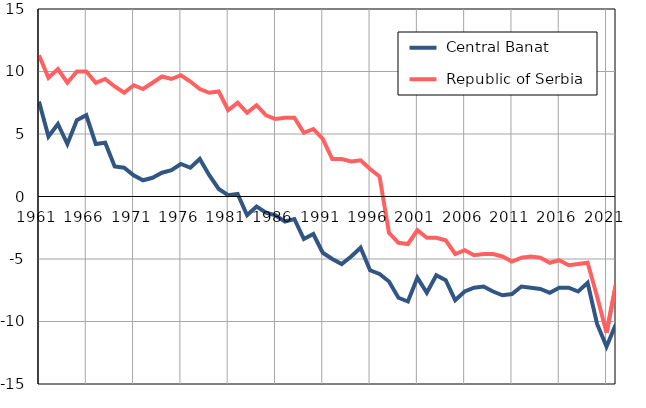
| Category |  Central Banat |  Republic of Serbia |
|---|---|---|
| 1961.0 | 7.6 | 11.3 |
| 1962.0 | 4.8 | 9.5 |
| 1963.0 | 5.8 | 10.2 |
| 1964.0 | 4.2 | 9.1 |
| 1965.0 | 6.1 | 10 |
| 1966.0 | 6.5 | 10 |
| 1967.0 | 4.2 | 9.1 |
| 1968.0 | 4.3 | 9.4 |
| 1969.0 | 2.4 | 8.8 |
| 1970.0 | 2.3 | 8.3 |
| 1971.0 | 1.7 | 8.9 |
| 1972.0 | 1.3 | 8.6 |
| 1973.0 | 1.5 | 9.1 |
| 1974.0 | 1.9 | 9.6 |
| 1975.0 | 2.1 | 9.4 |
| 1976.0 | 2.6 | 9.7 |
| 1977.0 | 2.3 | 9.2 |
| 1978.0 | 3 | 8.6 |
| 1979.0 | 1.7 | 8.3 |
| 1980.0 | 0.6 | 8.4 |
| 1981.0 | 0.1 | 6.9 |
| 1982.0 | 0.2 | 7.5 |
| 1983.0 | -1.5 | 6.7 |
| 1984.0 | -0.8 | 7.3 |
| 1985.0 | -1.3 | 6.5 |
| 1986.0 | -1.5 | 6.2 |
| 1987.0 | -2 | 6.3 |
| 1988.0 | -1.8 | 6.3 |
| 1989.0 | -3.4 | 5.1 |
| 1990.0 | -3 | 5.4 |
| 1991.0 | -4.5 | 4.6 |
| 1992.0 | -5 | 3 |
| 1993.0 | -5.4 | 3 |
| 1994.0 | -4.8 | 2.8 |
| 1995.0 | -4.1 | 2.9 |
| 1996.0 | -5.9 | 2.2 |
| 1997.0 | -6.2 | 1.6 |
| 1998.0 | -6.8 | -2.9 |
| 1999.0 | -8.1 | -3.7 |
| 2000.0 | -8.4 | -3.8 |
| 2001.0 | -6.5 | -2.7 |
| 2002.0 | -7.7 | -3.3 |
| 2003.0 | -6.3 | -3.3 |
| 2004.0 | -6.7 | -3.5 |
| 2005.0 | -8.3 | -4.6 |
| 2006.0 | -7.6 | -4.3 |
| 2007.0 | -7.3 | -4.7 |
| 2008.0 | -7.2 | -4.6 |
| 2009.0 | -7.6 | -4.6 |
| 2010.0 | -7.9 | -4.8 |
| 2011.0 | -7.8 | -5.2 |
| 2012.0 | -7.2 | -4.9 |
| 2013.0 | -7.3 | -4.8 |
| 2014.0 | -7.4 | -4.9 |
| 2015.0 | -7.7 | -5.3 |
| 2016.0 | -7.3 | -5.1 |
| 2017.0 | -7.3 | -5.5 |
| 2018.0 | -7.6 | -5.4 |
| 2019.0 | -6.9 | -5.3 |
| 2020.0 | -10.2 | -8 |
| 2021.0 | -12 | -10.9 |
| 2022.0 | -10.2 | -7 |